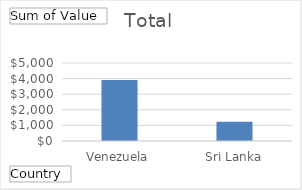
| Category | Total |
|---|---|
| Venezuela | 3906 |
| Sri Lanka | 1240 |